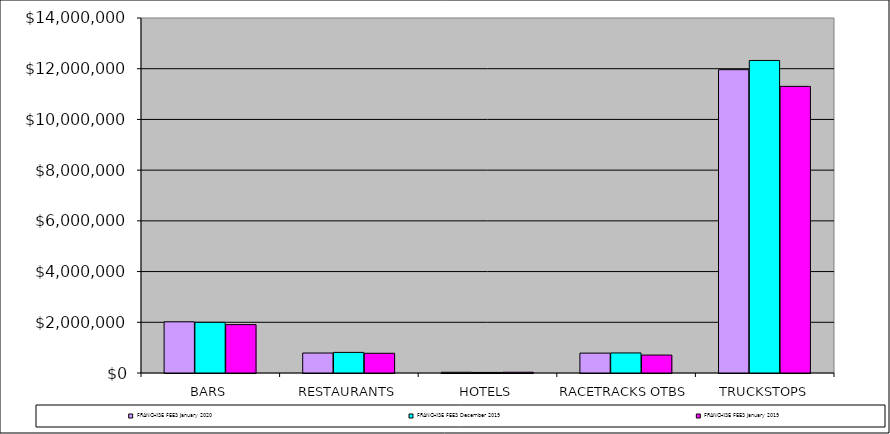
| Category | FRANCHISE FEES |
|---|---|
| BARS | 1907924 |
| RESTAURANTS | 777898 |
| HOTELS | 30016 |
| RACETRACKS OTBS | 707619 |
| TRUCKSTOPS | 11303974 |